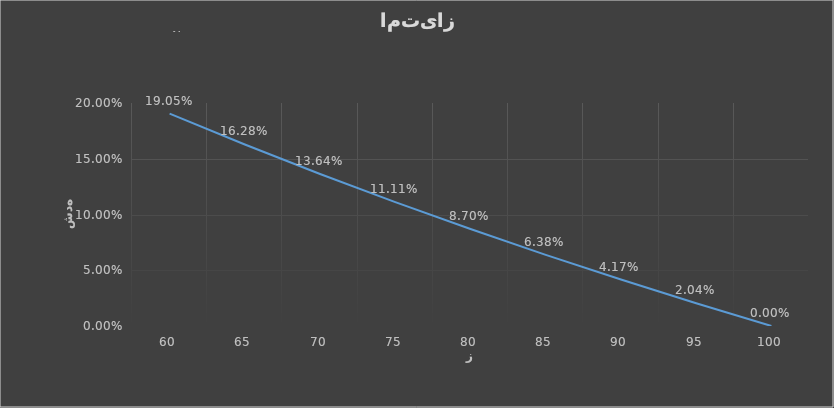
| Category | امتیاز |
|---|---|
| 60.0 | 0.19 |
| 65.0 | 0.163 |
| 70.0 | 0.136 |
| 75.0 | 0.111 |
| 80.0 | 0.087 |
| 85.0 | 0.064 |
| 90.0 | 0.042 |
| 95.0 | 0.02 |
| 100.0 | 0 |